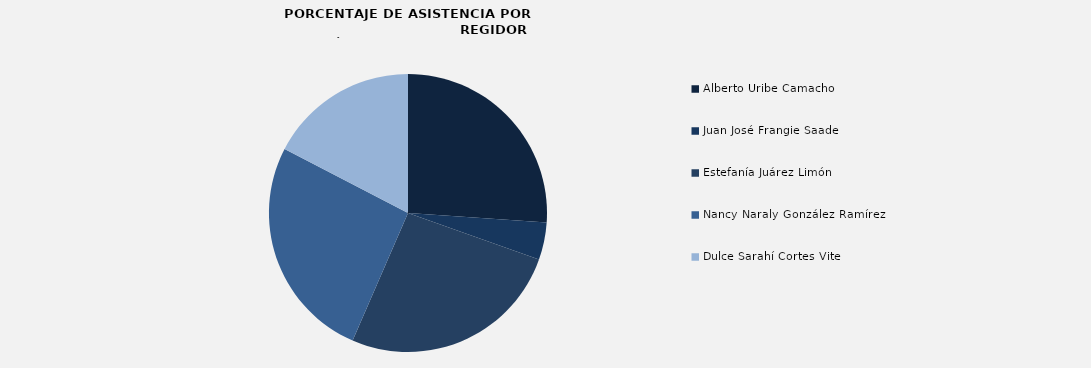
| Category | Alberto Uribe Camacho |
|---|---|
| Alberto Uribe Camacho | 100 |
| Juan José Frangie Saade | 16.667 |
| Estefanía Juárez Limón | 100 |
| Nancy Naraly González Ramírez | 100 |
| Dulce Sarahí Cortes Vite | 66.667 |